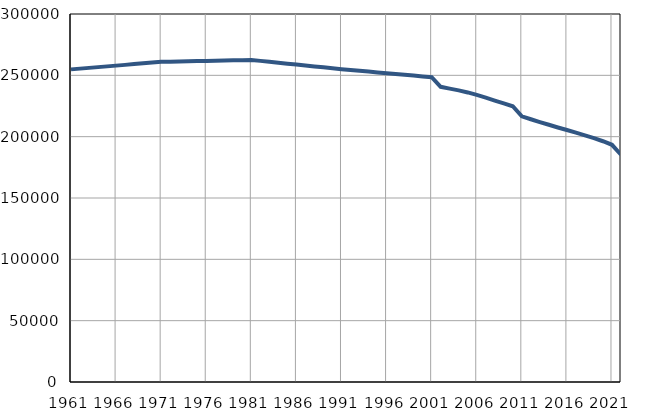
| Category | Population
size |
|---|---|
| 1961.0 | 254855 |
| 1962.0 | 255468 |
| 1963.0 | 256080 |
| 1964.0 | 256693 |
| 1965.0 | 257306 |
| 1966.0 | 257919 |
| 1967.0 | 258531 |
| 1968.0 | 259144 |
| 1969.0 | 259757 |
| 1970.0 | 260369 |
| 1971.0 | 260982 |
| 1972.0 | 261137 |
| 1973.0 | 261292 |
| 1974.0 | 261447 |
| 1975.0 | 261602 |
| 1976.0 | 261757 |
| 1977.0 | 261911 |
| 1978.0 | 262066 |
| 1979.0 | 262221 |
| 1980.0 | 262376 |
| 1981.0 | 262531 |
| 1982.0 | 261779 |
| 1983.0 | 261027 |
| 1984.0 | 260275 |
| 1985.0 | 259523 |
| 1986.0 | 258771 |
| 1987.0 | 258019 |
| 1988.0 | 257267 |
| 1989.0 | 256515 |
| 1990.0 | 255763 |
| 1991.0 | 255011 |
| 1992.0 | 254359 |
| 1993.0 | 253706 |
| 1994.0 | 253054 |
| 1995.0 | 252401 |
| 1996.0 | 251749 |
| 1997.0 | 251096 |
| 1998.0 | 250444 |
| 1999.0 | 249791 |
| 2000.0 | 249139 |
| 2001.0 | 248486 |
| 2002.0 | 240642 |
| 2003.0 | 239181 |
| 2004.0 | 237765 |
| 2005.0 | 236062 |
| 2006.0 | 234018 |
| 2007.0 | 231793 |
| 2008.0 | 229430 |
| 2009.0 | 227116 |
| 2010.0 | 224776 |
| 2011.0 | 216583 |
| 2012.0 | 214184 |
| 2013.0 | 211890 |
| 2014.0 | 209691 |
| 2015.0 | 207500 |
| 2016.0 | 205400 |
| 2017.0 | 203254 |
| 2018.0 | 201024 |
| 2019.0 | 198740 |
| 2020.0 | 196265 |
| 2021.0 | 193364 |
| 2022.0 | 185301 |